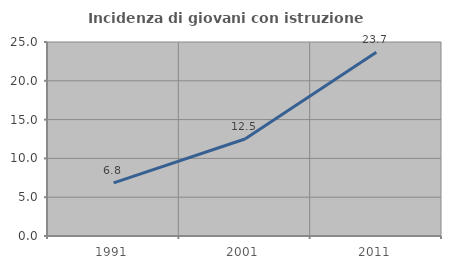
| Category | Incidenza di giovani con istruzione universitaria |
|---|---|
| 1991.0 | 6.849 |
| 2001.0 | 12.5 |
| 2011.0 | 23.684 |